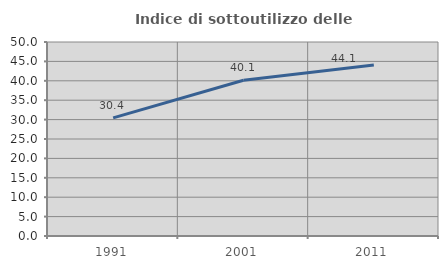
| Category | Indice di sottoutilizzo delle abitazioni  |
|---|---|
| 1991.0 | 30.437 |
| 2001.0 | 40.147 |
| 2011.0 | 44.057 |